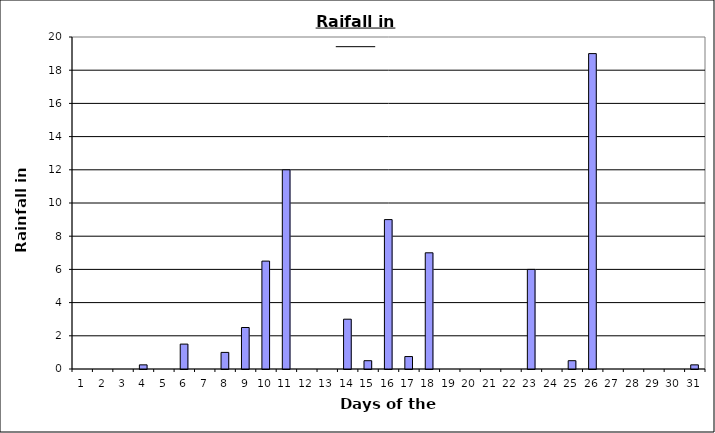
| Category | Series 0 |
|---|---|
| 0 | 0 |
| 1 | 0 |
| 2 | 0 |
| 3 | 0.25 |
| 4 | 0 |
| 5 | 1.5 |
| 6 | 0 |
| 7 | 1 |
| 8 | 2.5 |
| 9 | 6.5 |
| 10 | 12 |
| 11 | 0 |
| 12 | 0 |
| 13 | 3 |
| 14 | 0.5 |
| 15 | 9 |
| 16 | 0.75 |
| 17 | 7 |
| 18 | 0 |
| 19 | 0 |
| 20 | 0 |
| 21 | 0 |
| 22 | 6 |
| 23 | 0 |
| 24 | 0.5 |
| 25 | 19 |
| 26 | 0 |
| 27 | 0 |
| 28 | 0 |
| 29 | 0 |
| 30 | 0.25 |